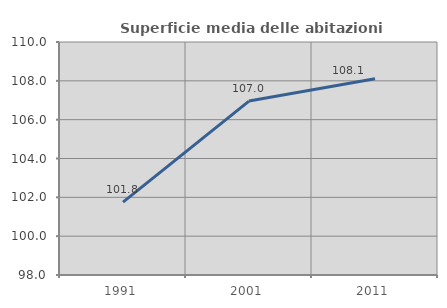
| Category | Superficie media delle abitazioni occupate |
|---|---|
| 1991.0 | 101.756 |
| 2001.0 | 106.958 |
| 2011.0 | 108.104 |